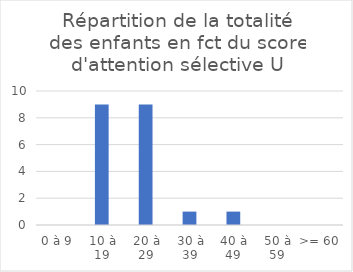
| Category | Series 0 |
|---|---|
| 0 à 9 | 0 |
| 10 à 19 | 9 |
| 20 à 29 | 9 |
| 30 à 39 | 1 |
| 40 à 49 | 1 |
| 50 à 59 | 0 |
| >= 60 | 0 |